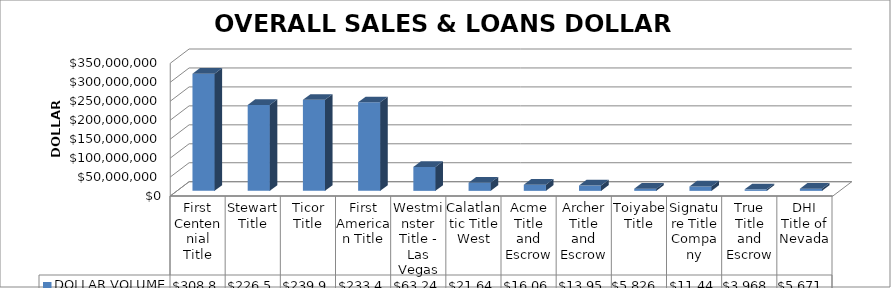
| Category | DOLLAR VOLUME |
|---|---|
| First Centennial Title | 308849563.96 |
| Stewart Title | 226515378.77 |
| Ticor Title | 239998347 |
| First American Title | 233447367.43 |
| Westminster Title - Las Vegas | 63241055 |
| Calatlantic Title West | 21648701 |
| Acme Title and Escrow | 16063346 |
| Archer Title and Escrow | 13958135 |
| Toiyabe Title | 5826400 |
| Signature Title Company | 11440612 |
| True Title and Escrow | 3968500 |
| DHI Title of Nevada | 5671525 |